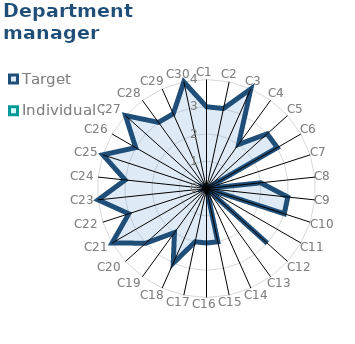
| Category | Target | Individual 2 |
|---|---|---|
| C1 | 3 | 0 |
| C2 | 3 | 0 |
| C3 | 4 | 0 |
| C4 | 2 | 0 |
| C5 | 3 | 0 |
| C6 | 3 | 0 |
| C7 | 0 | 0 |
| C8 | 2 | 0 |
| C9 | 3 | 0 |
| C10 | 3 | 0 |
| C11 | 0 | 0 |
| C12 | 3 | 0 |
| C13 | 0 | 0 |
| C14 | 0 | 0 |
| C15 | 2 | 0 |
| C16 | 2 | 0 |
| C17 | 2 | 0 |
| C18 | 3 | 0 |
| C19 | 2 | 0 |
| C20 | 3 | 0 |
| C21 | 4 | 0 |
| C22 | 3 | 0 |
| C23 | 4 | 0 |
| C24 | 3 | 0 |
| C25 | 4 | 0 |
| C26 | 3 | 0 |
| C27 | 4 | 0 |
| C28 | 3 | 0 |
| C29 | 3 | 0 |
| C30 | 4 | 0 |